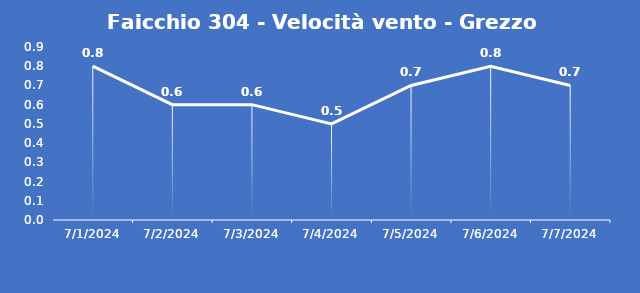
| Category | Faicchio 304 - Velocità vento - Grezzo (m/s) |
|---|---|
| 7/1/24 | 0.8 |
| 7/2/24 | 0.6 |
| 7/3/24 | 0.6 |
| 7/4/24 | 0.5 |
| 7/5/24 | 0.7 |
| 7/6/24 | 0.8 |
| 7/7/24 | 0.7 |